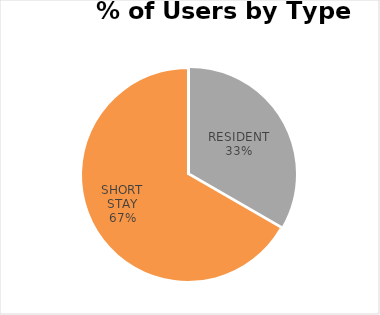
| Category | KINGS MEAD |
|---|---|
| COMMUTER | 0 |
| ILLEGAL | 0 |
| LONG STAY | 0 |
| RESIDENT | 2 |
| SHORT STAY | 4 |
| DISABLED | 0 |
| OTHER | 0 |